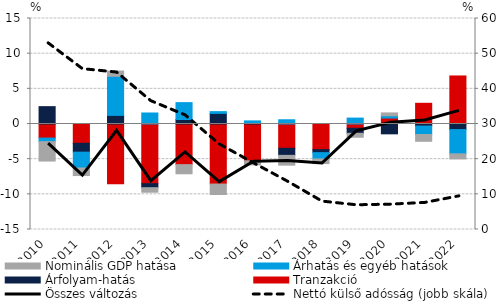
| Category | Tranzakció | Árfolyam-hatás | Árhatás és egyéb hatások | Nominális GDP hatása |
|---|---|---|---|---|
| 2010.0 | -1.998 | 2.468 | -0.513 | -2.755 |
| 2011.0 | -2.743 | -1.259 | -2.252 | -1.075 |
| 2012.0 | -8.512 | 1.223 | 5.559 | 0.749 |
| 2013.0 | -8.484 | -0.571 | 1.566 | -0.645 |
| 2014.0 | -5.778 | 0.638 | 2.399 | -1.3 |
| 2015.0 | -8.538 | 1.507 | 0.252 | -1.484 |
| 2016.0 | -5.233 | 0.205 | 0.236 | -0.582 |
| 2017.0 | -3.454 | -1.005 | 0.601 | -1.393 |
| 2018.0 | -3.642 | -0.43 | -0.891 | -0.664 |
| 2019.0 | -0.609 | -0.716 | 0.84 | -0.559 |
| 2020.0 | 0.846 | -1.398 | 0.33 | 0.4 |
| 2021.0 | 2.945 | -0.298 | -1.192 | -0.967 |
| 2022.0 | 6.832 | -0.792 | -3.448 | -0.725 |